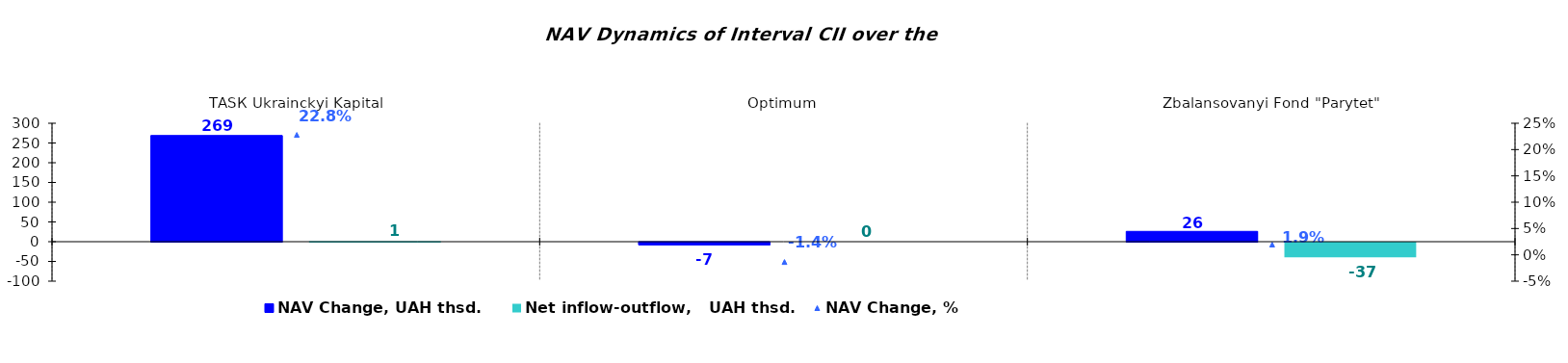
| Category | NAV Change, UAH thsd. | Net inflow-outflow,   UAH thsd. |
|---|---|---|
| ТАSК Ukrainckyi Kapital | 268.991 | 0.988 |
| Оptimum | -6.721 | 0 |
| Zbalansovanyi Fond "Parytet" | 26.135 | -37.051 |